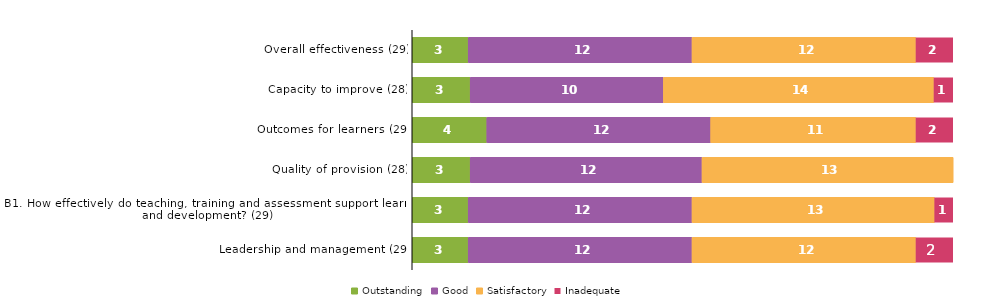
| Category | Outstanding | Good | Satisfactory | Inadequate |
|---|---|---|---|---|
| Overall effectiveness (29) | 3 | 12 | 12 | 2 |
| Capacity to improve (28) | 3 | 10 | 14 | 1 |
| Outcomes for learners (29) | 4 | 12 | 11 | 2 |
| Quality of provision (28) | 3 | 12 | 13 | 0 |
| B1. How effectively do teaching, training and assessment support learning and development? (29) | 3 | 12 | 13 | 1 |
| Leadership and management (29) | 3 | 12 | 12 | 2 |